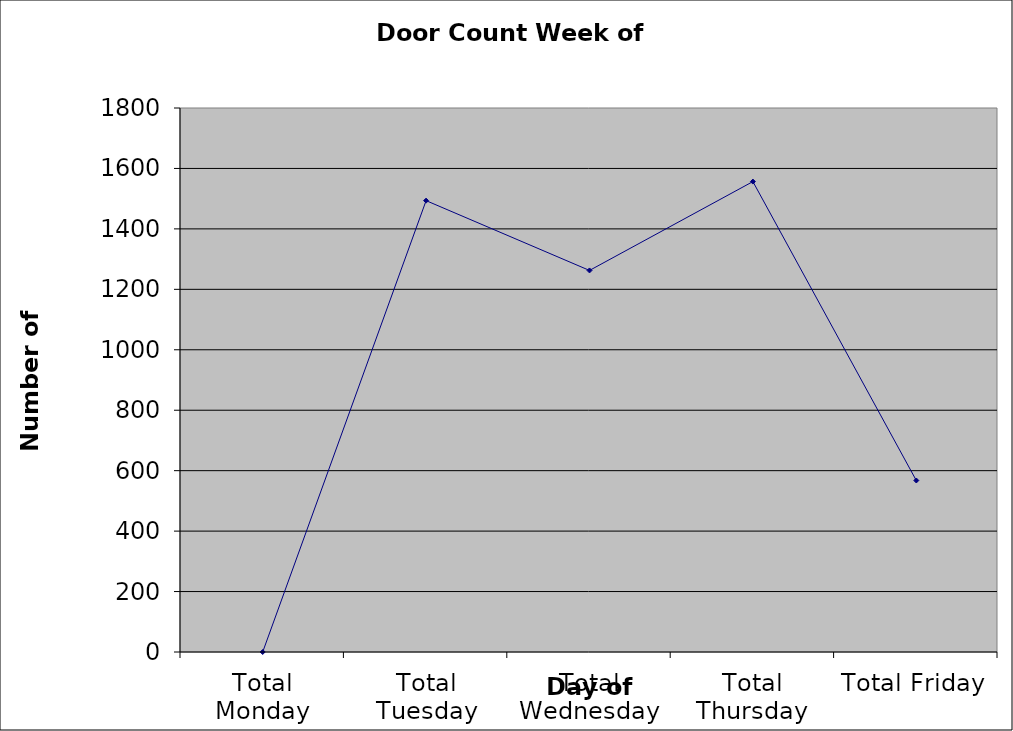
| Category | Series 0 |
|---|---|
| Total Monday | 0 |
| Total Tuesday | 1493.5 |
| Total Wednesday | 1262.5 |
| Total Thursday | 1556.5 |
| Total Friday | 567.5 |